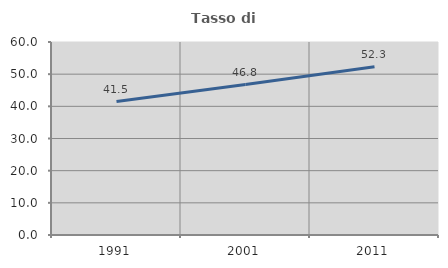
| Category | Tasso di occupazione   |
|---|---|
| 1991.0 | 41.486 |
| 2001.0 | 46.76 |
| 2011.0 | 52.292 |